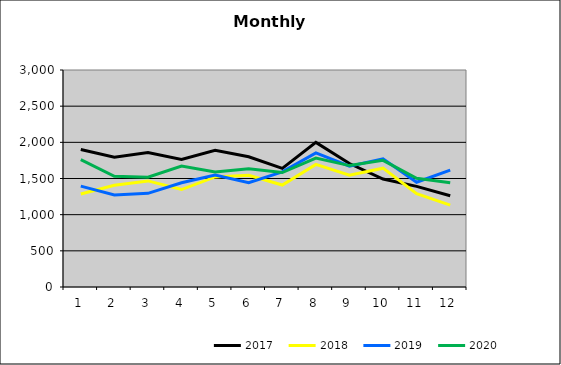
| Category | 2017 | 2018 | 2019 | 2020 |
|---|---|---|---|---|
| 0 | 1900.859 | 1286.21 | 1394.576 | 1762.064 |
| 1 | 1795.105 | 1406.556 | 1272.617 | 1530.829 |
| 2 | 1859.386 | 1466.695 | 1295.231 | 1518.163 |
| 3 | 1764.013 | 1347.408 | 1441.267 | 1671.58 |
| 4 | 1891.399 | 1522.181 | 1548.691 | 1589.128 |
| 5 | 1800.236 | 1543.945 | 1443.46 | 1634.409 |
| 6 | 1640.121 | 1409.491 | 1591.615 | 1582.785 |
| 7 | 1999.331 | 1694.901 | 1854.799 | 1783.031 |
| 8 | 1706.874 | 1545.104 | 1671.028 | 1678.417 |
| 9 | 1492.036 | 1642.816 | 1771.378 | 1751.194 |
| 10 | 1390.86 | 1288.934 | 1448.517 | 1503.037 |
| 11 | 1261.902 | 1131.485 | 1616.657 | 1439.988 |